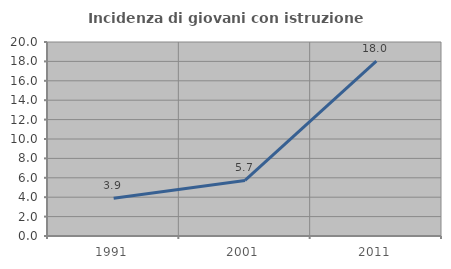
| Category | Incidenza di giovani con istruzione universitaria |
|---|---|
| 1991.0 | 3.896 |
| 2001.0 | 5.725 |
| 2011.0 | 18.026 |